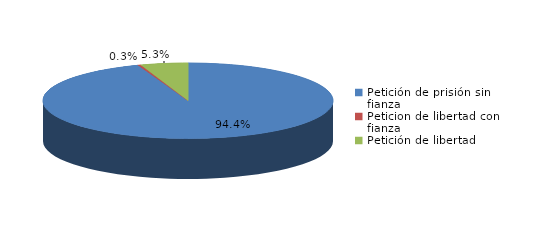
| Category | Series 0 |
|---|---|
| Petición de prisión sin fianza | 2300 |
| Peticion de libertad con fianza | 8 |
| Petición de libertad | 129 |